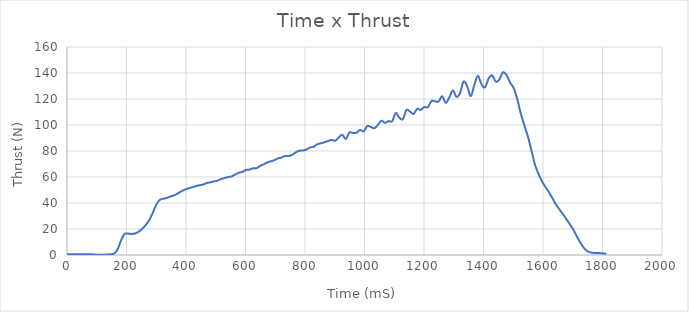
| Category | Thrust(N) |
|---|---|
| 0.0 | 0.511 |
| 12.0 | 0.512 |
| 24.0 | 0.512 |
| 36.0 | 0.513 |
| 48.0 | 0.515 |
| 60.0 | 0.513 |
| 72.0 | 0.52 |
| 84.0 | 0.528 |
| 96.0 | 0.327 |
| 109.0 | 0.151 |
| 121.0 | 0.2 |
| 133.0 | 0.306 |
| 145.0 | 0.486 |
| 157.0 | 1.023 |
| 169.0 | 3.76 |
| 181.0 | 10.835 |
| 193.0 | 16.069 |
| 205.0 | 16.462 |
| 217.0 | 16.152 |
| 229.0 | 16.586 |
| 241.0 | 17.876 |
| 253.0 | 20.189 |
| 265.0 | 23.214 |
| 277.0 | 27.067 |
| 289.0 | 32.778 |
| 301.0 | 39.149 |
| 313.0 | 42.544 |
| 325.0 | 43.332 |
| 337.0 | 44.039 |
| 349.0 | 45.092 |
| 361.0 | 45.956 |
| 373.0 | 47.43 |
| 385.0 | 49.096 |
| 397.0 | 50.351 |
| 409.0 | 51.255 |
| 421.0 | 52.114 |
| 433.0 | 52.907 |
| 445.0 | 53.68 |
| 457.0 | 54.166 |
| 469.0 | 55.309 |
| 481.0 | 55.869 |
| 493.0 | 56.554 |
| 505.0 | 57.161 |
| 517.0 | 58.34 |
| 529.0 | 59.165 |
| 541.0 | 59.889 |
| 553.0 | 60.442 |
| 565.0 | 61.848 |
| 577.0 | 63.233 |
| 589.0 | 63.953 |
| 601.0 | 65.365 |
| 613.0 | 65.651 |
| 625.0 | 66.689 |
| 637.0 | 66.781 |
| 649.0 | 68.515 |
| 661.0 | 69.712 |
| 673.0 | 71.164 |
| 685.0 | 72.036 |
| 697.0 | 72.965 |
| 709.0 | 74.347 |
| 721.0 | 74.902 |
| 733.0 | 76.213 |
| 745.0 | 76.074 |
| 757.0 | 77.115 |
| 769.0 | 78.933 |
| 781.0 | 80.188 |
| 793.0 | 80.4 |
| 805.0 | 81.108 |
| 817.0 | 82.735 |
| 829.0 | 83.24 |
| 841.0 | 85.177 |
| 853.0 | 85.921 |
| 865.0 | 86.667 |
| 877.0 | 87.669 |
| 889.0 | 88.539 |
| 901.0 | 87.91 |
| 913.0 | 90.286 |
| 925.0 | 92.514 |
| 937.0 | 89.227 |
| 949.0 | 94.23 |
| 961.0 | 93.919 |
| 973.0 | 94.027 |
| 985.0 | 96.208 |
| 997.0 | 95.051 |
| 1009.0 | 99.11 |
| 1021.0 | 98.532 |
| 1033.0 | 97.459 |
| 1045.0 | 100.002 |
| 1057.0 | 103.338 |
| 1069.0 | 101.635 |
| 1081.0 | 102.987 |
| 1093.0 | 102.879 |
| 1105.0 | 109.25 |
| 1117.0 | 105.604 |
| 1129.0 | 104.547 |
| 1141.0 | 111.565 |
| 1153.0 | 110.317 |
| 1165.0 | 108.464 |
| 1177.0 | 112.505 |
| 1189.0 | 111.619 |
| 1201.0 | 113.814 |
| 1213.0 | 113.748 |
| 1225.0 | 118.427 |
| 1237.0 | 118.206 |
| 1249.0 | 118.037 |
| 1261.0 | 122.173 |
| 1273.0 | 117.023 |
| 1285.0 | 121.232 |
| 1297.0 | 126.564 |
| 1309.0 | 121.717 |
| 1321.0 | 124.384 |
| 1333.0 | 133.415 |
| 1345.0 | 129.855 |
| 1357.0 | 122.093 |
| 1369.0 | 130.57 |
| 1381.0 | 137.841 |
| 1393.0 | 131.418 |
| 1405.0 | 128.997 |
| 1417.0 | 135.727 |
| 1429.0 | 138.225 |
| 1441.0 | 133.451 |
| 1453.0 | 134.793 |
| 1465.0 | 140.471 |
| 1477.0 | 138.629 |
| 1489.0 | 132.706 |
| 1501.0 | 128.649 |
| 1513.0 | 120.37 |
| 1525.0 | 109.113 |
| 1537.0 | 99.945 |
| 1549.0 | 91.363 |
| 1561.0 | 80.562 |
| 1573.0 | 69.485 |
| 1585.0 | 62.272 |
| 1597.0 | 56.498 |
| 1609.0 | 52.071 |
| 1621.0 | 47.865 |
| 1633.0 | 43.12 |
| 1645.0 | 38.433 |
| 1657.0 | 34.504 |
| 1669.0 | 30.841 |
| 1681.0 | 26.778 |
| 1693.0 | 22.723 |
| 1705.0 | 18.236 |
| 1717.0 | 12.944 |
| 1730.0 | 7.955 |
| 1741.0 | 4.53 |
| 1753.0 | 2.552 |
| 1765.0 | 1.741 |
| 1777.0 | 1.557 |
| 1789.0 | 1.51 |
| 1801.0 | 1.244 |
| 1813.0 | 0.882 |